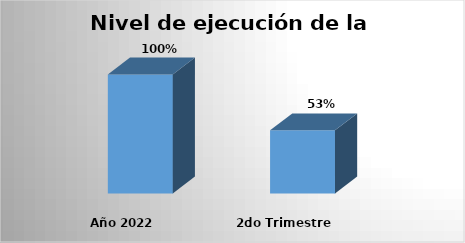
| Category | Series 0 |
|---|---|
| Año 2022 | 1 |
| 2do Trimestre | 0.53 |